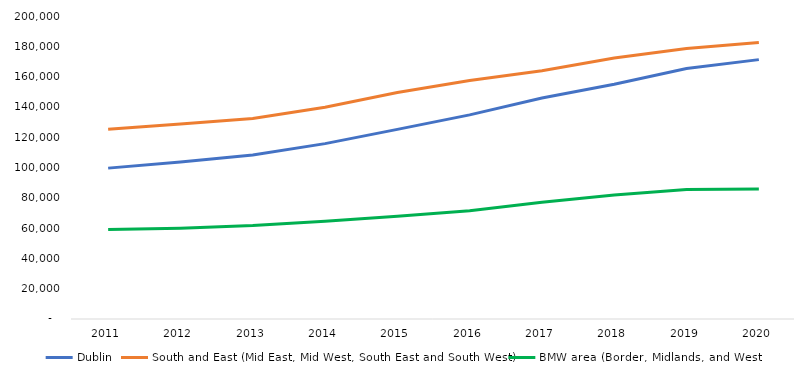
| Category | Dublin | South and East (Mid East, Mid West, South East and South West) | BMW area (Border, Midlands, and West) |
|---|---|---|---|
| 2011.0 | 99587 | 125200 | 59057 |
| 2012.0 | 103590 | 128767 | 59950 |
| 2013.0 | 108273 | 132392 | 61674 |
| 2014.0 | 115755 | 139804 | 64594 |
| 2015.0 | 125166 | 149447 | 67882 |
| 2016.0 | 134722 | 157480 | 71530 |
| 2017.0 | 145840 | 163858 | 77003 |
| 2018.0 | 154984 | 172222 | 81782 |
| 2019.0 | 165348 | 178482 | 85469 |
| 2020.0 | 171206 | 182444 | 85732 |